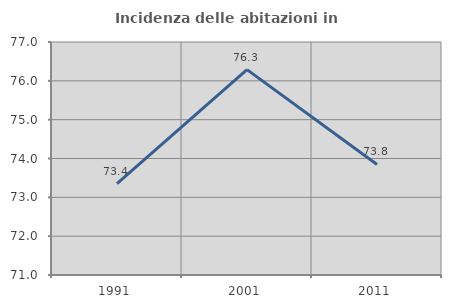
| Category | Incidenza delle abitazioni in proprietà  |
|---|---|
| 1991.0 | 73.353 |
| 2001.0 | 76.289 |
| 2011.0 | 73.846 |